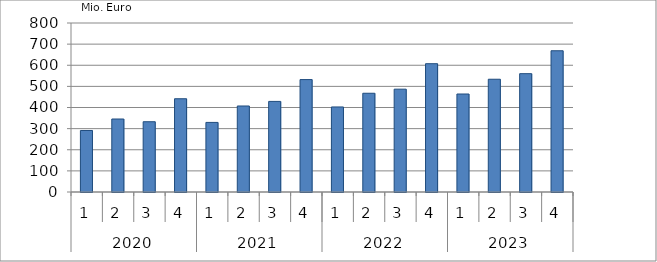
| Category | Ausbaugewerblicher Umsatz3 |
|---|---|
| 0 | 291272.144 |
| 1 | 345494.215 |
| 2 | 332629.265 |
| 3 | 441463.36 |
| 4 | 329380.212 |
| 5 | 407164.972 |
| 6 | 428783.222 |
| 7 | 532137.089 |
| 8 | 402625.565 |
| 9 | 467398.849 |
| 10 | 486819.26 |
| 11 | 607390.303 |
| 12 | 463895.067 |
| 13 | 533766.53 |
| 14 | 560194.5 |
| 15 | 668571.293 |